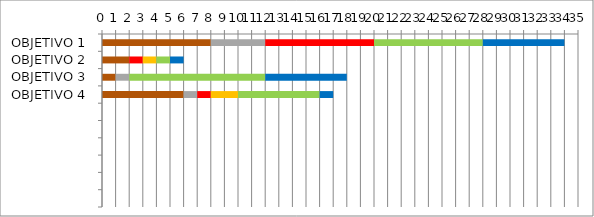
| Category | Series 0 | Series 1 | Series 2 | Series 3 | Series 4 | Series 5 |
|---|---|---|---|---|---|---|
| OBJETIVO 1 | 8 | 4 | 8 | 0 | 8 | 6 |
| OBJETIVO 2 | 2 | 0 | 1 | 1 | 1 | 1 |
| OBJETIVO 3 | 1 | 1 | 0 | 0 | 10 | 6 |
| OBJETIVO 4 | 6 | 1 | 1 | 2 | 6 | 1 |